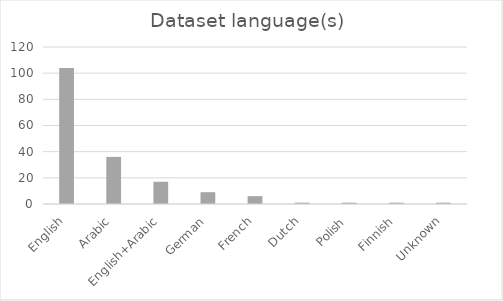
| Category | Dataset language(s) |
|---|---|
| English | 104 |
| Arabic | 36 |
| English+Arabic | 17 |
| German | 9 |
| French | 6 |
| Dutch | 1 |
| Polish | 1 |
| Finnish | 1 |
| Unknown | 1 |